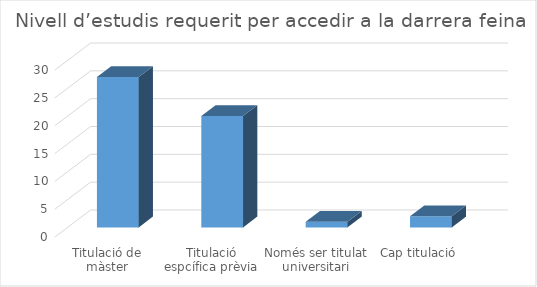
| Category | Series 0 |
|---|---|
| Titulació de màster | 27 |
| Titulació espcífica prèvia | 20 |
| Només ser titulat universitari | 1 |
| Cap titulació | 2 |